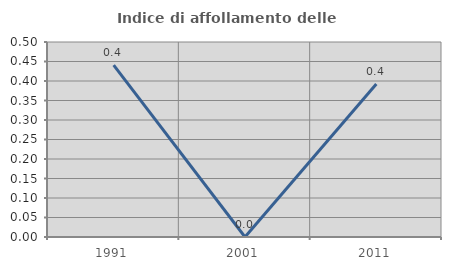
| Category | Indice di affollamento delle abitazioni  |
|---|---|
| 1991.0 | 0.441 |
| 2001.0 | 0 |
| 2011.0 | 0.392 |